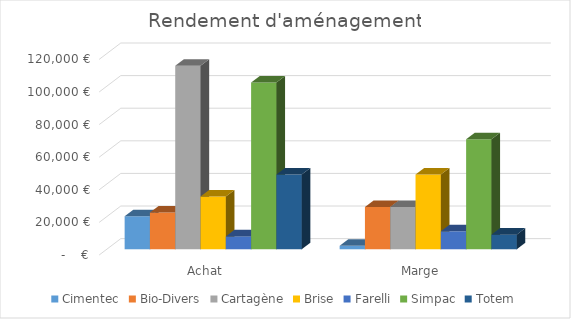
| Category | Cimentec | Bio-Divers | Cartagène | Brise | Farelli | Simpac | Totem |
|---|---|---|---|---|---|---|---|
| Achat | 20254 | 22548 | 112548 | 32412 | 7899 | 102245 | 45873 |
| Marge | 2089 | 25897 | 25897 | 45872 | 11025 | 67445 | 8972 |